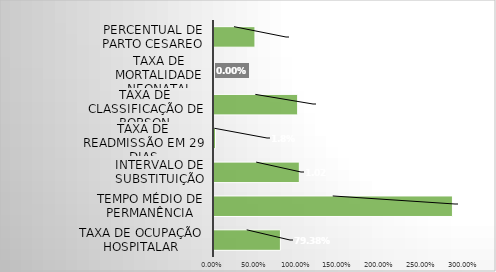
| Category | Series 0 |
|---|---|
| Taxa de Ocupação Hospitalar | 0.794 |
| Tempo Médio de permanência | 2.85 |
| Intervalo de substituição | 1.02 |
| Taxa de readmissão em 29 dias | 0.018 |
| Taxa de classificação de Robson | 1 |
| Taxa de mortalidade neonatal | 0 |
| Percentual de parto cesareo | 0.49 |